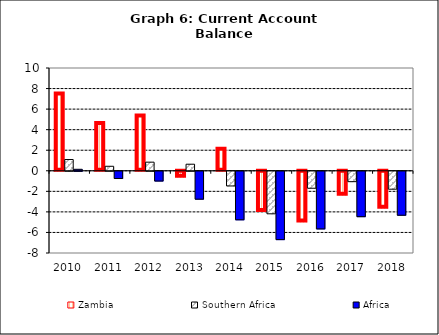
| Category | Zambia | Southern Africa | Africa |
|---|---|---|---|
| 2010.0 | 7.527 | 1.095 | 0.144 |
| 2011.0 | 4.658 | 0.439 | -0.706 |
| 2012.0 | 5.382 | 0.839 | -0.95 |
| 2013.0 | -0.59 | 0.638 | -2.715 |
| 2014.0 | 2.139 | -1.429 | -4.722 |
| 2015.0 | -3.909 | -4.138 | -6.65 |
| 2016.0 | -4.929 | -1.65 | -5.608 |
| 2017.0 | -2.322 | -1.011 | -4.418 |
| 2018.0 | -3.603 | -1.744 | -4.278 |